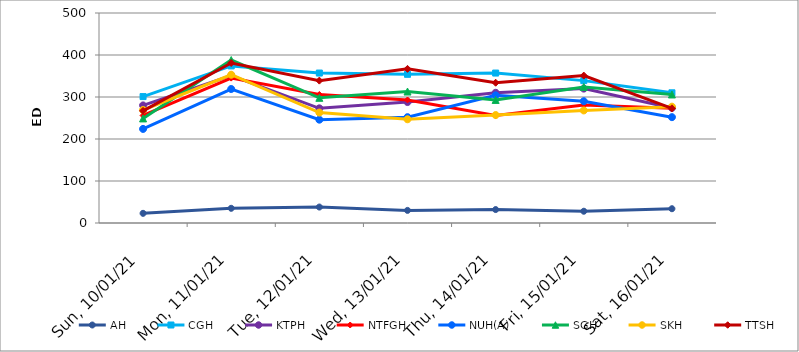
| Category | AH | CGH | KTPH | NTFGH | NUH(A) | SGH | SKH | TTSH |
|---|---|---|---|---|---|---|---|---|
| 2021-01-10 | 23 | 301 | 280 | 256 | 224 | 249 | 269 | 267 |
| 2021-01-11 | 35 | 374 | 351 | 345 | 319 | 388 | 353 | 381 |
| 2021-01-12 | 38 | 357 | 273 | 306 | 246 | 298 | 263 | 339 |
| 2021-01-13 | 30 | 354 | 288 | 293 | 252 | 313 | 247 | 367 |
| 2021-01-14 | 32 | 357 | 310 | 256 | 304 | 293 | 257 | 334 |
| 2021-01-15 | 28 | 339 | 320 | 281 | 290 | 324 | 268 | 351 |
| 2021-01-16 | 34 | 310 | 274 | 273 | 252 | 306 | 277 | 273 |